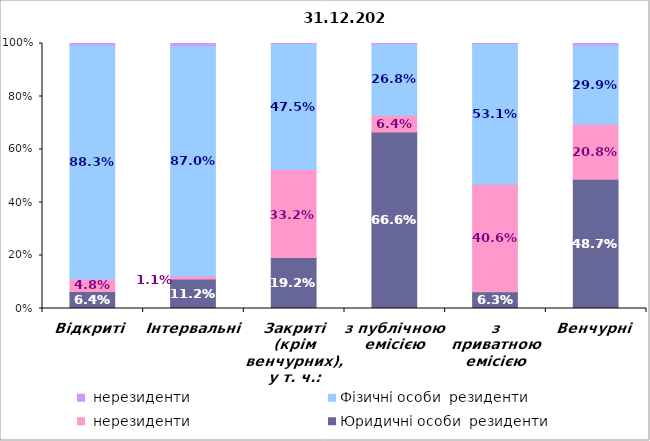
| Category | Юридичні особи  резиденти   | Юридичні особи  нерезиденти   | Фізичні особи  резиденти   | Фізичні особи  нерезиденти   |
|---|---|---|---|---|
| Відкриті | 0.064 | 0.048 | 0.883 | 0.005 |
| Інтервальні | 0.112 | 0.011 | 0.87 | 0.007 |
| Закриті (крім венчурних), у т. ч.: | 0.192 | 0.332 | 0.475 | 0 |
| з публічною емісією | 0.666 | 0.064 | 0.268 | 0.002 |
| з приватною емісією | 0.063 | 0.406 | 0.531 | 0 |
| Венчурні | 0.487 | 0.208 | 0.299 | 0.006 |